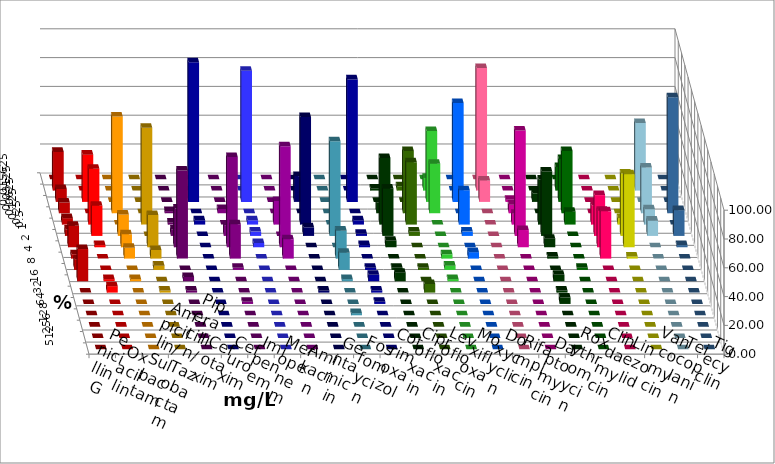
| Category | Penicillin G | Oxacillin | Ampicillin/ Sulbactam | Piperacillin/ Tazobactam | Cefotaxim | Cefuroxim | Imipenem | Meropenem | Amikacin | Gentamicin | Fosfomycin | Cotrimoxazol | Ciprofloxacin | Levofloxacin | Moxifloxacin | Doxycyclin | Rifampicin | Daptomycin | Roxythromycin | Clindamycin | Linezolid | Vancomycin | Teicoplanin | Tigecyclin |
|---|---|---|---|---|---|---|---|---|---|---|---|---|---|---|---|---|---|---|---|---|---|---|---|---|
| 0.015625 | 0 | 0 | 0 | 0 | 0 | 0 | 0 | 0 | 0 | 0 | 0 | 0 | 0 | 0 | 0 | 0 | 0 | 0 | 0 | 0 | 0 | 0 | 0 | 0 |
| 0.03125 | 26.866 | 0 | 0 | 0 | 0 | 0 | 0 | 0 | 0 | 0 | 0 | 0 | 1.493 | 2.985 | 8.955 | 0 | 85.075 | 0 | 0 | 16.418 | 0 | 0 | 0 | 46.97 |
| 0.0625 | 8.955 | 32.836 | 0 | 0 | 0 | 0 | 97.015 | 91.045 | 0 | 17.91 | 0 | 85.075 | 0 | 0 | 49.254 | 68.657 | 14.925 | 1.493 | 5.97 | 29.851 | 0 | 0 | 0 | 0 |
| 0.125 | 7.463 | 0 | 67.164 | 0 | 1.493 | 2.985 | 0 | 0 | 0 | 0 | 0 | 0 | 7.463 | 43.284 | 34.328 | 0 | 0 | 5.97 | 0 | 43.284 | 0 | 0 | 80.597 | 31.818 |
| 0.25 | 4.478 | 38.806 | 0 | 67.164 | 1.493 | 0 | 2.985 | 2.985 | 16.418 | 74.627 | 0 | 2.985 | 46.269 | 43.284 | 0 | 23.881 | 0 | 7.463 | 31.343 | 8.955 | 13.433 | 4.478 | 0 | 10.606 |
| 0.5 | 4.478 | 20.896 | 14.925 | 0 | 4.478 | 7.463 | 0 | 2.985 | 0 | 5.97 | 65.672 | 1.493 | 32.836 | 2.985 | 0 | 2.985 | 0 | 73.134 | 44.776 | 0 | 28.358 | 43.284 | 17.91 | 10.606 |
| 1.0 | 14.925 | 1.493 | 8.955 | 22.388 | 26.866 | 62.687 | 0 | 2.985 | 70.149 | 0 | 0 | 1.493 | 4.478 | 0 | 0 | 0 | 0 | 11.94 | 5.97 | 0 | 25.373 | 50.746 | 1.493 | 0 |
| 2.0 | 2.985 | 0 | 7.463 | 5.97 | 61.194 | 23.881 | 0 | 0 | 13.433 | 0 | 19.403 | 0 | 0 | 0 | 2.985 | 4.478 | 0 | 0 | 1.493 | 0 | 32.836 | 1.493 | 0 | 0 |
| 4.0 | 7.463 | 0 | 0 | 2.985 | 0 | 1.493 | 0 | 0 | 0 | 0 | 11.94 | 1.493 | 1.493 | 1.493 | 2.985 | 0 | 0 | 0 | 0 | 1.493 | 0 | 0 | 0 | 0 |
| 8.0 | 22.388 | 1.493 | 1.493 | 0 | 2.985 | 0 | 0 | 0 | 0 | 0 | 1.493 | 4.478 | 5.97 | 0 | 1.493 | 0 | 0 | 0 | 4.478 | 0 | 0 | 0 | 0 | 0 |
| 16.0 | 0 | 4.478 | 0 | 1.493 | 1.493 | 0 | 0 | 0 | 0 | 1.493 | 0 | 1.493 | 0 | 5.97 | 0 | 0 | 0 | 0 | 1.493 | 0 | 0 | 0 | 0 | 0 |
| 32.0 | 0 | 0 | 0 | 0 | 0 | 1.493 | 0 | 0 | 0 | 0 | 0 | 1.493 | 0 | 0 | 0 | 0 | 0 | 0 | 4.478 | 0 | 0 | 0 | 0 | 0 |
| 64.0 | 0 | 0 | 0 | 0 | 0 | 0 | 0 | 0 | 0 | 0 | 1.493 | 0 | 0 | 0 | 0 | 0 | 0 | 0 | 0 | 0 | 0 | 0 | 0 | 0 |
| 128.0 | 0 | 0 | 0 | 0 | 0 | 0 | 0 | 0 | 0 | 0 | 0 | 0 | 0 | 0 | 0 | 0 | 0 | 0 | 0 | 0 | 0 | 0 | 0 | 0 |
| 256.0 | 0 | 0 | 0 | 0 | 0 | 0 | 0 | 0 | 0 | 0 | 0 | 0 | 0 | 0 | 0 | 0 | 0 | 0 | 0 | 0 | 0 | 0 | 0 | 0 |
| 512.0 | 0 | 0 | 0 | 0 | 0 | 0 | 0 | 0 | 0 | 0 | 0 | 0 | 0 | 0 | 0 | 0 | 0 | 0 | 0 | 0 | 0 | 0 | 0 | 0 |